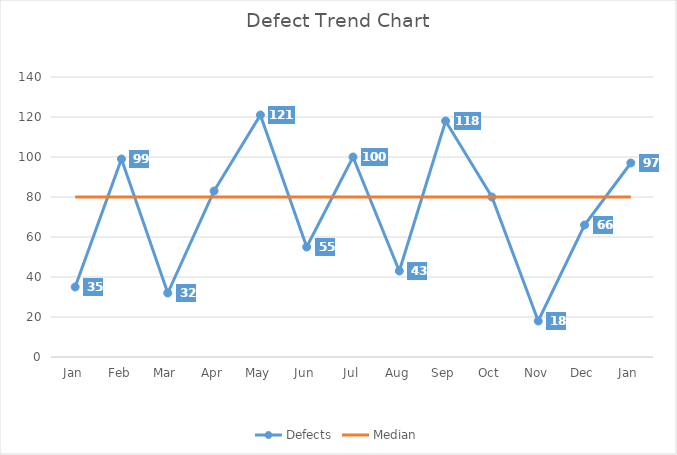
| Category | Defects | Median |
|---|---|---|
| Jan | 35 | 80 |
| Feb | 99 | 80 |
| Mar | 32 | 80 |
| Apr | 83 | 80 |
| May | 121 | 80 |
| Jun | 55 | 80 |
| Jul | 100 | 80 |
| Aug | 43 | 80 |
| Sep | 118 | 80 |
| Oct | 80 | 80 |
| Nov | 18 | 80 |
| Dec | 66 | 80 |
| Jan | 97 | 80 |